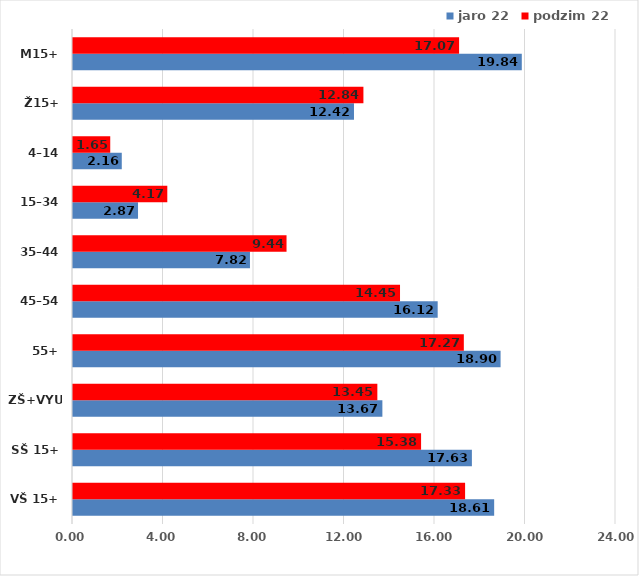
| Category | jaro 22 | podzim 22 |
|---|---|---|
| VŠ 15+ | 18.615 | 17.33 |
| SŠ 15+ | 17.63 | 15.385 |
| ZŠ+VYUČ | 13.674 | 13.452 |
| 55+ | 18.898 | 17.274 |
| 45–54 | 16.119 | 14.454 |
| 35–44 | 7.822 | 9.438 |
| 15–34 | 2.874 | 4.168 |
| 4–14 | 2.156 | 1.646 |
| Ž15+ | 12.419 | 12.836 |
| M15+ | 19.836 | 17.065 |